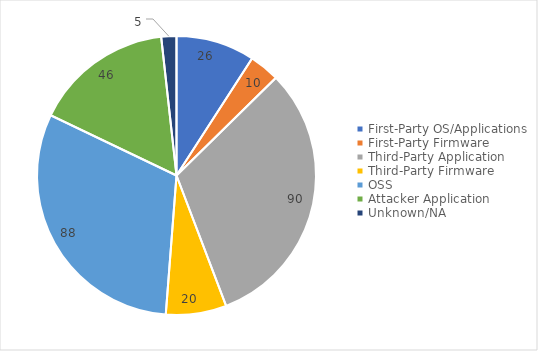
| Category | Series 0 |
|---|---|
| First-Party OS/Applications | 26 |
| First-Party Firmware | 10 |
| Third-Party Application | 90 |
| Third-Party Firmware | 20 |
| OSS | 88 |
| Attacker Application | 46 |
| Unknown/NA | 5 |